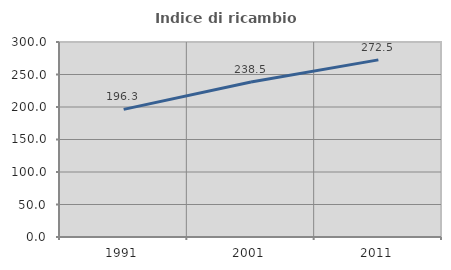
| Category | Indice di ricambio occupazionale  |
|---|---|
| 1991.0 | 196.296 |
| 2001.0 | 238.462 |
| 2011.0 | 272.5 |